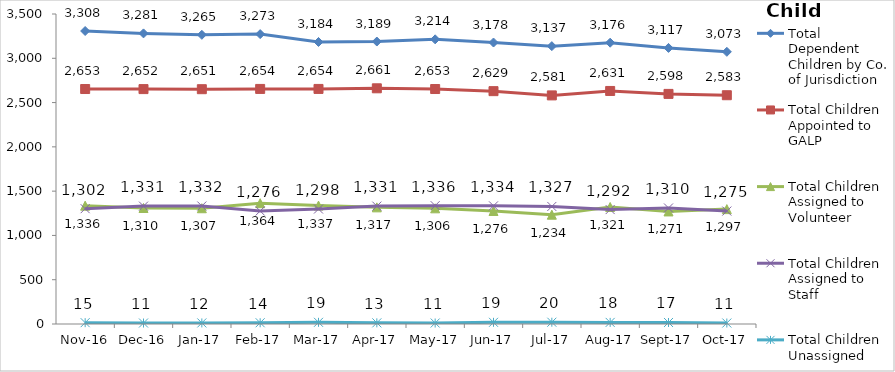
| Category | Total Dependent Children by Co. of Jurisdiction | Total Children Appointed to GALP | Total Children Assigned to Volunteer | Total Children Assigned to Staff | Total Children Unassigned |
|---|---|---|---|---|---|
| 2016-11-01 | 3308 | 2653 | 1336 | 1302 | 15 |
| 2016-12-01 | 3281 | 2652 | 1310 | 1331 | 11 |
| 2017-01-01 | 3265 | 2651 | 1307 | 1332 | 12 |
| 2017-02-01 | 3273 | 2654 | 1364 | 1276 | 14 |
| 2017-03-01 | 3184 | 2654 | 1337 | 1298 | 19 |
| 2017-04-01 | 3189 | 2661 | 1317 | 1331 | 13 |
| 2017-05-01 | 3214 | 2653 | 1306 | 1336 | 11 |
| 2017-06-01 | 3178 | 2629 | 1276 | 1334 | 19 |
| 2017-07-01 | 3137 | 2581 | 1234 | 1327 | 20 |
| 2017-08-01 | 3176 | 2631 | 1321 | 1292 | 18 |
| 2017-09-01 | 3117 | 2598 | 1271 | 1310 | 17 |
| 2017-10-01 | 3073 | 2583 | 1297 | 1275 | 11 |